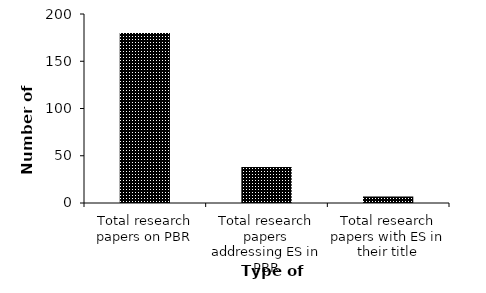
| Category | Series 0 |
|---|---|
| Total research papers on PBR | 180 |
| Total research papers addressing ES in PBR | 38 |
| Total research papers with ES in their title | 7 |